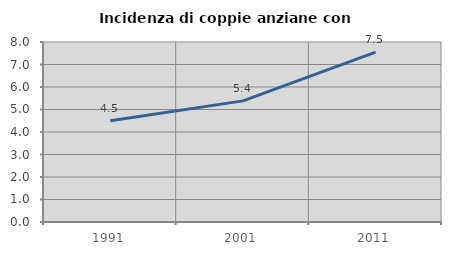
| Category | Incidenza di coppie anziane con figli |
|---|---|
| 1991.0 | 4.503 |
| 2001.0 | 5.383 |
| 2011.0 | 7.547 |